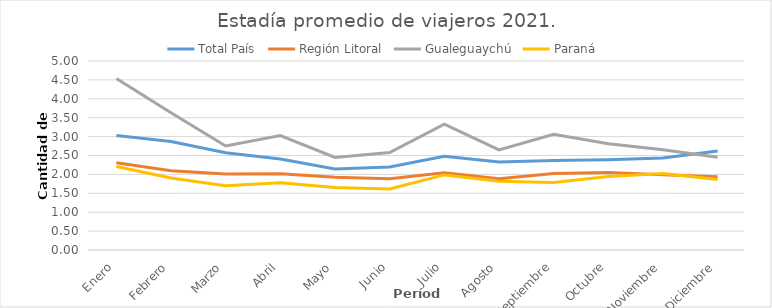
| Category | Total País | Región Litoral | Gualeguaychú | Paraná |
|---|---|---|---|---|
| Enero | 3.028 | 2.307 | 4.539 | 2.21 |
| Febrero | 2.868 | 2.098 | 3.631 | 1.907 |
| Marzo | 2.574 | 2.01 | 2.752 | 1.701 |
| Abril | 2.409 | 2.018 | 3.026 | 1.778 |
| Mayo | 2.144 | 1.927 | 2.448 | 1.653 |
| Junio | 2.197 | 1.885 | 2.579 | 1.613 |
| Julio | 2.479 | 2.045 | 3.328 | 1.987 |
| Agosto | 2.328 | 1.883 | 2.647 | 1.818 |
| Septiembre | 2.365 | 2.022 | 3.061 | 1.786 |
| Octubre | 2.388 | 2.053 | 2.812 | 1.945 |
| Noviembre | 2.437 | 1.99 | 2.655 | 2.024 |
| Diciembre | 2.62 | 1.94 | 2.455 | 1.867 |